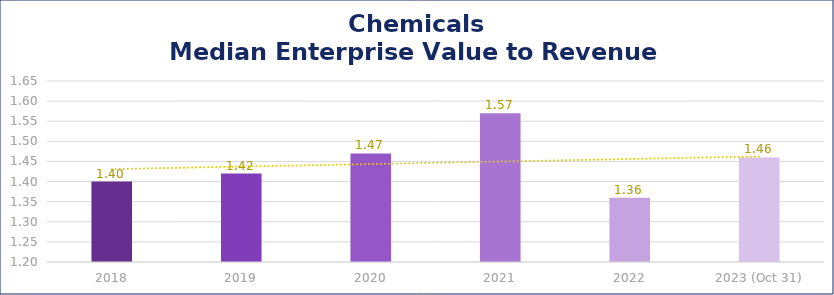
| Category | Chemicals |
|---|---|
| 2018 | 1.4 |
| 2019 | 1.42 |
| 2020 | 1.47 |
| 2021 | 1.57 |
| 2022 | 1.36 |
| 2023 (Oct 31) | 1.46 |